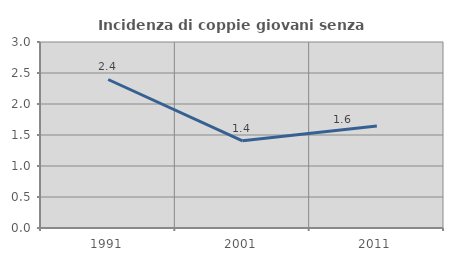
| Category | Incidenza di coppie giovani senza figli |
|---|---|
| 1991.0 | 2.395 |
| 2001.0 | 1.406 |
| 2011.0 | 1.645 |